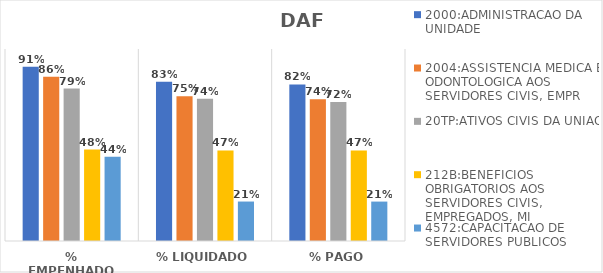
| Category | 2000:ADMINISTRACAO DA UNIDADE | 2004:ASSISTENCIA MEDICA E ODONTOLOGICA AOS SERVIDORES CIVIS, EMPR | 20TP:ATIVOS CIVIS DA UNIAO | 212B:BENEFICIOS OBRIGATORIOS AOS SERVIDORES CIVIS, EMPREGADOS, MI | 4572:CAPACITACAO DE SERVIDORES PUBLICOS FEDERAIS EM PROCESSO DE Q |
|---|---|---|---|---|---|
| % EMPENHADO | 0.907 | 0.856 | 0.794 | 0.476 | 0.438 |
| % LIQUIDADO | 0.829 | 0.754 | 0.741 | 0.472 | 0.205 |
| % PAGO | 0.816 | 0.739 | 0.724 | 0.472 | 0.205 |